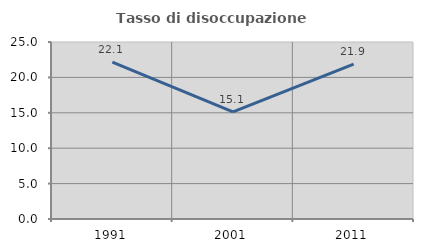
| Category | Tasso di disoccupazione giovanile  |
|---|---|
| 1991.0 | 22.143 |
| 2001.0 | 15.116 |
| 2011.0 | 21.875 |